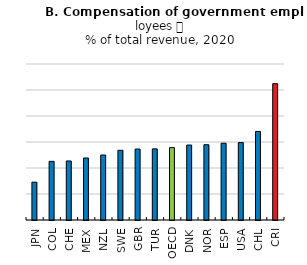
| Category | Series 0 |
|---|---|
| JPN | 14.542 |
| COL | 22.553 |
| CHE | 22.708 |
| MEX | 23.857 |
| NZL | 24.99 |
| SWE | 26.804 |
| GBR | 27.294 |
| TUR | 27.354 |
| OECD | 27.839 |
| DNK | 28.828 |
| NOR | 28.953 |
| ESP | 29.546 |
| USA | 29.791 |
| CHL | 34.063 |
| CRI | 52.437 |